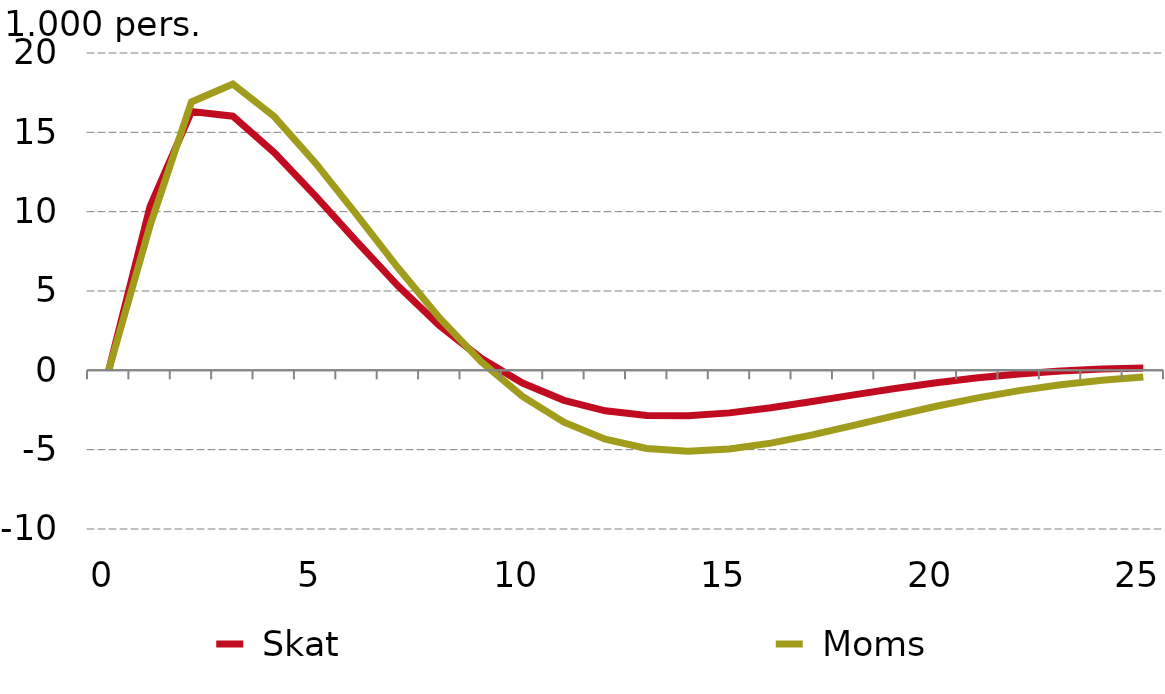
| Category |  Skat |  Moms |
|---|---|---|
| 0.0 | 0 | 0 |
| nan | 10.328 | 9.122 |
| nan | 16.312 | 16.917 |
| nan | 16.019 | 18.044 |
| nan | 13.726 | 15.992 |
| 5.0 | 10.981 | 13.058 |
| nan | 8.095 | 9.784 |
| nan | 5.297 | 6.43 |
| nan | 2.806 | 3.281 |
| nan | 0.756 | 0.552 |
| 10.0 | -0.805 | -1.641 |
| nan | -1.891 | -3.265 |
| nan | -2.55 | -4.341 |
| nan | -2.851 | -4.928 |
| nan | -2.869 | -5.105 |
| 15.0 | -2.681 | -4.961 |
| nan | -2.36 | -4.587 |
| nan | -1.965 | -4.065 |
| nan | -1.548 | -3.466 |
| nan | -1.144 | -2.851 |
| 20.0 | -0.781 | -2.263 |
| nan | -0.473 | -1.732 |
| nan | -0.228 | -1.278 |
| nan | -0.046 | -0.908 |
| nan | 0.078 | -0.622 |
| 25.0 | 0.151 | -0.414 |